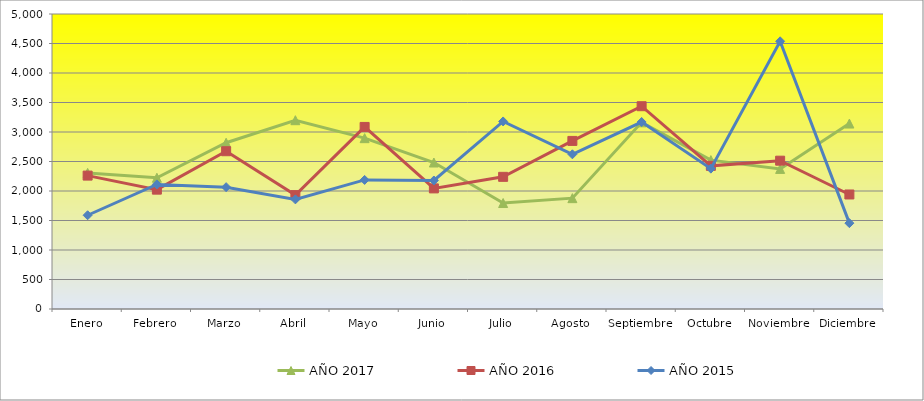
| Category | AÑO 2017 | AÑO 2016 | AÑO 2015 |
|---|---|---|---|
| Enero | 2307.097 | 2261 | 1589 |
| Febrero | 2224.516 | 2023 | 2112 |
| Marzo | 2818.065 | 2674 | 2065 |
| Abril | 3200 | 1930 | 1858 |
| Mayo | 2895.484 | 3086 | 2188 |
| Junio | 2482.581 | 2044 | 2178 |
| Julio | 1796.129 | 2240 | 3179 |
| Agosto | 1878.71 | 2849 | 2622 |
| Septiembre | 3163.871 | 3437 | 3169 |
| Octubre | 2523.438 | 2426 | 2379 |
| Noviembre | 2374.688 | 2514 | 4537 |
| Diciembre | 3143.226 | 1941 | 1455 |